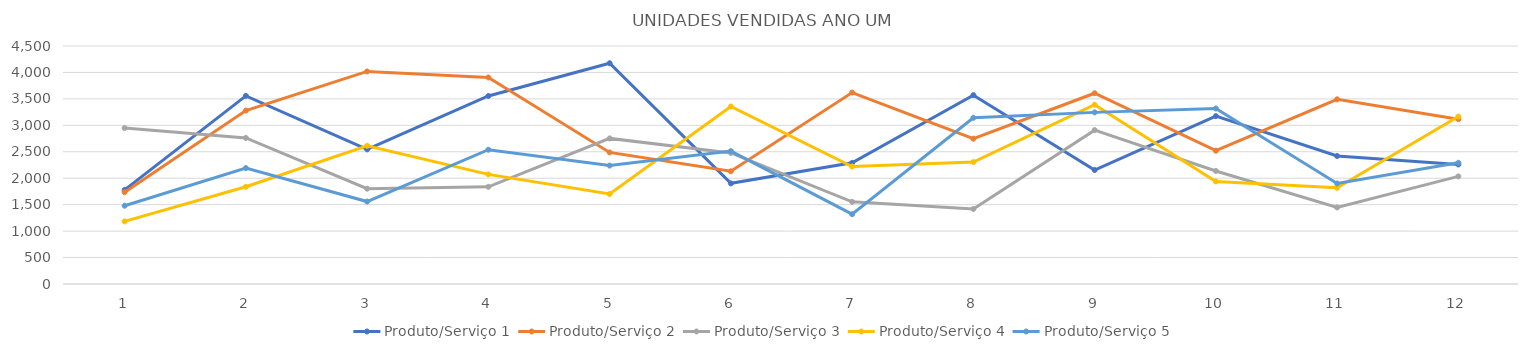
| Category | Produto/Serviço 1 | Produto/Serviço 2 | Produto/Serviço 3 | Produto/Serviço 4 | Produto/Serviço 5 |
|---|---|---|---|---|---|
| 0 | 1779 | 1737 | 2949 | 1184 | 1480 |
| 1 | 3557 | 3279 | 2762 | 1838 | 2192 |
| 2 | 2546 | 4019 | 1802 | 2613 | 1559 |
| 3 | 3555 | 3905 | 1838 | 2073 | 2539 |
| 4 | 4174 | 2488 | 2753 | 1702 | 2239 |
| 5 | 1903 | 2131 | 2478 | 3356 | 2513 |
| 6 | 2291 | 3619 | 1553 | 2222 | 1320 |
| 7 | 3571 | 2747 | 1419 | 2305 | 3142 |
| 8 | 2155 | 3607 | 2909 | 3390 | 3245 |
| 9 | 3174 | 2520 | 2137 | 1939 | 3318 |
| 10 | 2420 | 3492 | 1448 | 1819 | 1900 |
| 11 | 2260 | 3117 | 2035 | 3166 | 2292 |